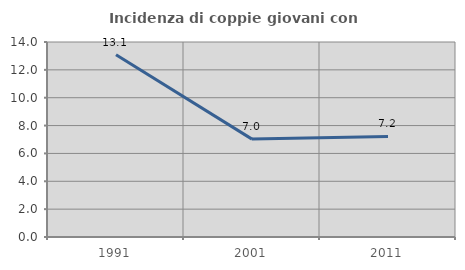
| Category | Incidenza di coppie giovani con figli |
|---|---|
| 1991.0 | 13.089 |
| 2001.0 | 7.027 |
| 2011.0 | 7.216 |